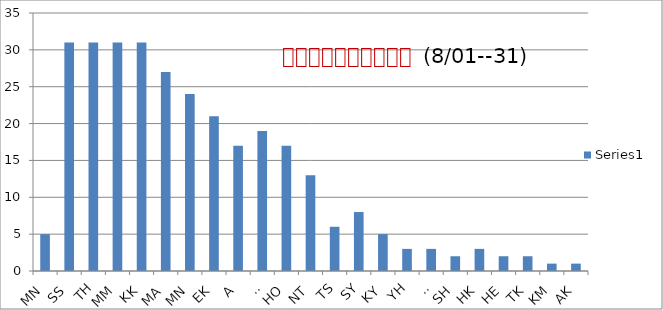
| Category | Series 0 |
|---|---|
| MN | 5 |
| SS | 31 |
| TH | 31 |
| MM | 31 |
| KK | 31 |
| MA | 27 |
| MN | 24 |
| EK | 21 |
| A | 17 |
| SI | 19 |
| HO | 17 |
| NT | 13 |
| TS | 6 |
| SY | 8 |
| KY | 5 |
| YH | 3 |
| HI | 3 |
| SH | 2 |
| HK | 3 |
| HE | 2 |
| TK | 2 |
| KM | 1 |
| AK | 1 |